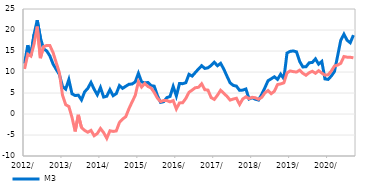
| Category | M3  | Домаћи кредити немонетарном сектору |
|---|---|---|
| 2012-01-01 | 12.01 | 10.729 |
| 2012-02-01 | 16.354 | 14.221 |
| 2012-03-01 | 13.992 | 13.782 |
| 2012-04-01 | 18.952 | 16.69 |
| 2012-05-01 | 22.329 | 20.823 |
| 2012-06-01 | 18.134 | 13.296 |
| 2012-07-01 | 15.507 | 16.043 |
| 2012-08-01 | 15.015 | 16.313 |
| 2012-09-01 | 13.837 | 16.292 |
| 2012-10-01 | 11.912 | 14.641 |
| 2012-11-01 | 10.629 | 12.241 |
| 2012-12-01 | 9.421 | 9.834 |
| 2013-01-01 | 6.554 | 4.448 |
| 2013-02-01 | 5.916 | 2.211 |
| 2013-03-01 | 8.196 | 1.791 |
| 2013-04-01 | 4.809 | -0.816 |
| 2013-05-01 | 4.39 | -4.149 |
| 2013-06-01 | 4.482 | -0.203 |
| 2013-07-01 | 3.358 | -3.232 |
| 2013-08-01 | 5.277 | -3.913 |
| 2013-09-01 | 6.108 | -4.338 |
| 2013-10-01 | 7.502 | -3.897 |
| 2013-11-01 | 5.896 | -5.181 |
| 2013-12-01 | 4.573 | -4.65 |
| 2014-01-01 | 6.313 | -3.453 |
| 2014-02-01 | 4.038 | -4.43 |
| 2014-03-01 | 4.234 | -5.804 |
| 2014-04-01 | 5.797 | -3.993 |
| 2014-05-01 | 4.358 | -4.149 |
| 2014-06-01 | 4.845 | -4.035 |
| 2014-07-01 | 6.767 | -2.016 |
| 2014-08-01 | 6.108 | -1.198 |
| 2014-09-01 | 6.605 | -0.64 |
| 2014-10-01 | 7.075 | 1.254 |
| 2014-11-01 | 7.143 | 2.874 |
| 2014-12-01 | 7.648 | 4.423 |
| 2015-01-01 | 9.694 | 7.684 |
| 2015-02-01 | 7.639 | 6.418 |
| 2015-03-01 | 7.404 | 7.278 |
| 2015-04-01 | 7.508 | 6.557 |
| 2015-05-01 | 6.749 | 6.196 |
| 2015-06-01 | 6.629 | 5.14 |
| 2015-07-01 | 4.381 | 3.777 |
| 2015-08-01 | 2.769 | 2.955 |
| 2015-09-01 | 2.936 | 3.226 |
| 2015-10-01 | 3.902 | 3.199 |
| 2015-11-01 | 4.175 | 2.893 |
| 2015-12-01 | 6.564 | 3.196 |
| 2016-01-01 | 4.278 | 1.199 |
| 2016-02-01 | 7.267 | 2.638 |
| 2016-03-01 | 7.218 | 2.687 |
| 2016-04-01 | 7.458 | 3.711 |
| 2016-05-01 | 9.45 | 5.171 |
| 2016-06-01 | 9.03 | 5.69 |
| 2016-07-01 | 9.881 | 6.257 |
| 2016-08-01 | 10.715 | 6.355 |
| 2016-09-01 | 11.496 | 7.196 |
| 2016-10-01 | 10.853 | 5.785 |
| 2016-11-01 | 11.002 | 5.691 |
| 2016-12-01 | 11.553 | 3.906 |
| 2017-01-01 | 12.319 | 3.474 |
| 2017-02-01 | 11.489 | 4.47 |
| 2017-03-01 | 12.067 | 5.654 |
| 2017-04-01 | 10.696 | 4.923 |
| 2017-05-01 | 9.013 | 4.221 |
| 2017-06-01 | 7.423 | 3.312 |
| 2017-07-01 | 6.807 | 3.565 |
| 2017-08-01 | 6.642 | 3.755 |
| 2017-09-01 | 5.632 | 2.278 |
| 2017-10-01 | 5.691 | 3.574 |
| 2017-11-01 | 5.952 | 4.092 |
| 2017-12-01 | 3.567 | 3.671 |
| 2018-01-01 | 3.888 | 3.977 |
| 2018-02-01 | 3.511 | 3.859 |
| 2018-03-01 | 3.318 | 3.502 |
| 2018-04-01 | 4.689 | 3.953 |
| 2018-05-01 | 6.249 | 5.016 |
| 2018-06-01 | 7.929 | 5.586 |
| 2018-07-01 | 8.383 | 4.847 |
| 2018-08-01 | 8.861 | 5.412 |
| 2018-09-01 | 8.24 | 7.016 |
| 2018-10-31 | 9.483 | 7.163 |
| 2018-11-30 | 8.409 | 7.417 |
| 2018-12-31 | 14.522 | 9.795 |
| 2019-01-31 | 14.909 | 10.252 |
| 2019-02-28 | 15.018 | 10.086 |
| 2019-03-31 | 14.797 | 9.982 |
| 2019-04-30 | 12.506 | 10.444 |
| 2019-05-31 | 11.216 | 9.694 |
| 2019-06-30 | 11.23 | 9.224 |
| 2019-07-31 | 12.186 | 9.826 |
| 2019-08-31 | 12.279 | 10.177 |
| 2019-09-30 | 13.127 | 9.697 |
| 2019-10-31 | 11.864 | 10.311 |
| 2019-11-30 | 12.513 | 9.755 |
| 2019-12-31 | 8.354 | 9.245 |
| 2020-01-31 | 8.237 | 9.334 |
| 2020-02-29 | 9.035 | 10.229 |
| 2020-03-31 | 10.113 | 11.424 |
| 2020-04-30 | 13.811 | 11.641 |
| 2020-05-31 | 17.557 | 12.071 |
| 2020-06-30 | 18.995 | 13.679 |
| 2020-07-31 | 17.552 | 13.526 |
| 2020-08-31 | 16.965 | 13.505 |
| 2020-09-30 | 18.779 | 13.379 |